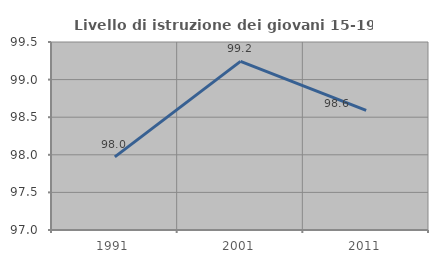
| Category | Livello di istruzione dei giovani 15-19 anni |
|---|---|
| 1991.0 | 97.973 |
| 2001.0 | 99.242 |
| 2011.0 | 98.592 |